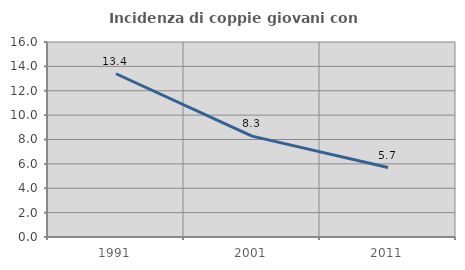
| Category | Incidenza di coppie giovani con figli |
|---|---|
| 1991.0 | 13.395 |
| 2001.0 | 8.279 |
| 2011.0 | 5.698 |